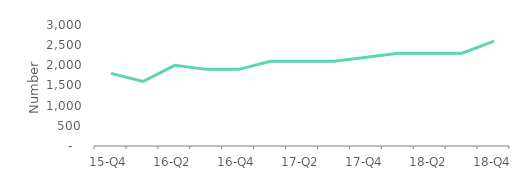
| Category | Full market |
|---|---|
| 15-Q4 | 1800 |
| 16-Q1 | 1600 |
| 16-Q2 | 2000 |
| 16-Q3 | 1900 |
| 16-Q4 | 1900 |
| 17-Q1 | 2100 |
| 17-Q2 | 2100 |
| 17-Q3 | 2100 |
| 17-Q4 | 2200 |
| 18-Q1 | 2300 |
| 18-Q2 | 2300 |
| 18-Q3 | 2300 |
| 18-Q4 | 2600 |